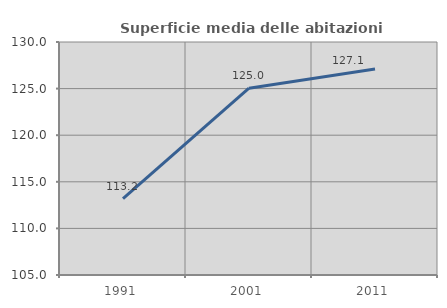
| Category | Superficie media delle abitazioni occupate |
|---|---|
| 1991.0 | 113.2 |
| 2001.0 | 125.044 |
| 2011.0 | 127.11 |